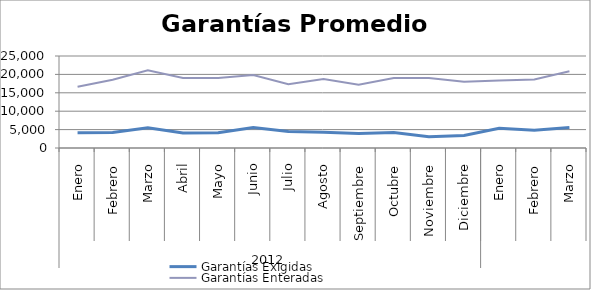
| Category | Garantías Exigidas | Garantías Enteradas |
|---|---|---|
| 0 | 4146.8 | 16662.483 |
| 1 | 4190.531 | 18572.749 |
| 2 | 5482.211 | 21128.648 |
| 3 | 4079.038 | 18997.51 |
| 4 | 4141.554 | 19005.364 |
| 5 | 5549.139 | 19818.91 |
| 6 | 4487.023 | 17351.39 |
| 7 | 4277.924 | 18719.955 |
| 8 | 3940.893 | 17217.403 |
| 9 | 4180.69 | 19046.939 |
| 10 | 3056.997 | 19028.425 |
| 11 | 3426.799 | 17994.819 |
| 12 | 5390.461 | 18317.043 |
| 13 | 4807.91 | 18608.477 |
| 14 | 5582.739 | 20850.446 |